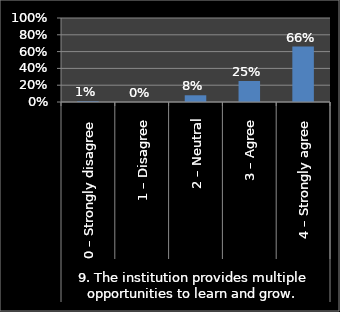
| Category | Series 0 |
|---|---|
| 0 | 0.01 |
| 1 | 0 |
| 2 | 0.08 |
| 3 | 0.25 |
| 4 | 0.66 |